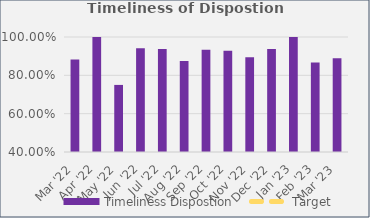
| Category | Timeliness Dispostion |
|---|---|
| Mar '22 | 0.882 |
| Apr '22 | 1 |
| May '22 | 0.75 |
| Jun '22 | 0.941 |
| Jul '22 | 0.938 |
| Aug '22 | 0.875 |
| Sep '22 | 0.933 |
| Oct '22 | 0.929 |
| Nov '22 | 0.895 |
| Dec '22 | 0.938 |
| Jan '23 | 1 |
| Feb '23 | 0.867 |
| Mar '23 | 0.889 |